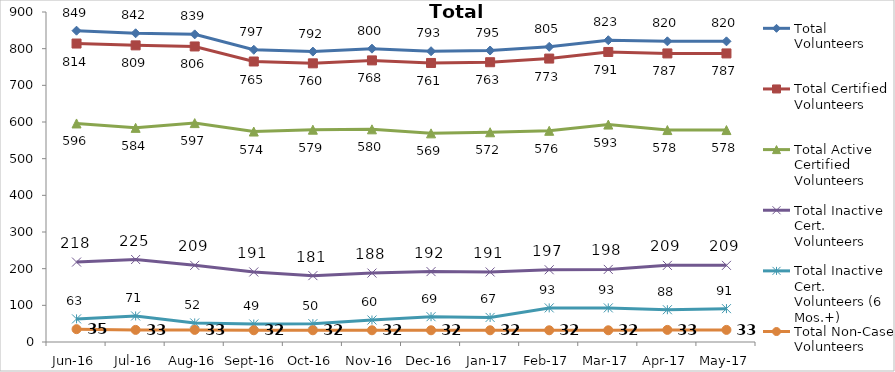
| Category | Total Volunteers | Total Certified Volunteers | Total Active Certified Volunteers | Total Inactive Cert. Volunteers | Total Inactive Cert. Volunteers (6 Mos.+) | Total Non-Case Volunteers |
|---|---|---|---|---|---|---|
| Jun-16 | 849 | 814 | 596 | 218 | 63 | 35 |
| Jul-16 | 842 | 809 | 584 | 225 | 71 | 33 |
| Aug-16 | 839 | 806 | 597 | 209 | 52 | 33 |
| Sep-16 | 797 | 765 | 574 | 191 | 49 | 32 |
| Oct-16 | 792 | 760 | 579 | 181 | 50 | 32 |
| Nov-16 | 800 | 768 | 580 | 188 | 60 | 32 |
| Dec-16 | 793 | 761 | 569 | 192 | 69 | 32 |
| Jan-17 | 795 | 763 | 572 | 191 | 67 | 32 |
| Feb-17 | 805 | 773 | 576 | 197 | 93 | 32 |
| Mar-17 | 823 | 791 | 593 | 198 | 93 | 32 |
| Apr-17 | 820 | 787 | 578 | 209 | 88 | 33 |
| May-17 | 820 | 787 | 578 | 209 | 91 | 33 |